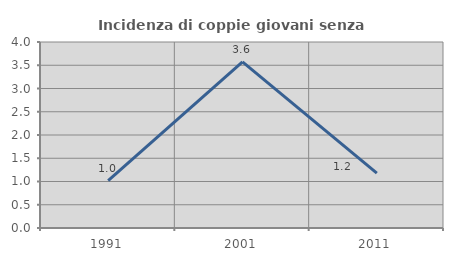
| Category | Incidenza di coppie giovani senza figli |
|---|---|
| 1991.0 | 1.017 |
| 2001.0 | 3.571 |
| 2011.0 | 1.181 |